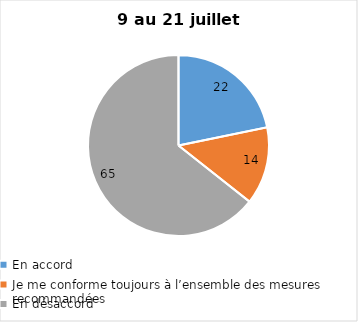
| Category | Series 0 |
|---|---|
| En accord | 22 |
| Je me conforme toujours à l’ensemble des mesures recommandées | 14 |
| En désaccord | 65 |